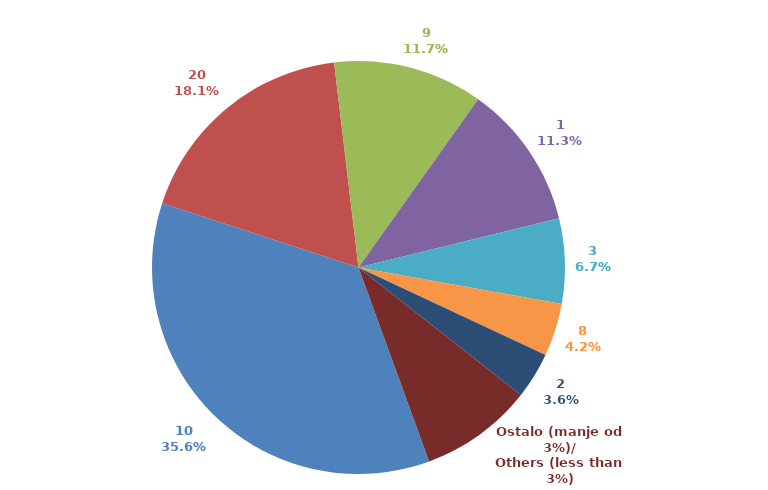
| Category | Series 0 |
|---|---|
| 10 | 0.356 |
| 20 | 0.181 |
| 9 | 0.117 |
| 1 | 0.113 |
| 3 | 0.067 |
| 8 | 0.041 |
| 2 | 0.036 |
| Ostalo (manje od 3%)/
Others (less than 3%) | 0.088 |